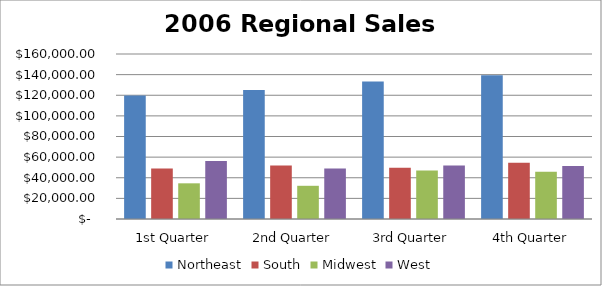
| Category | Northeast | South | Midwest | West |
|---|---|---|---|---|
| 1st Quarter | 119700 | 48900 | 34600 | 56200 |
| 2nd Quarter | 125100 | 52000 | 32200 | 49000 |
| 3rd Quarter | 133400 | 49600 | 47000 | 52000 |
| 4th Quarter | 139500 | 54500 | 45900 | 51300 |